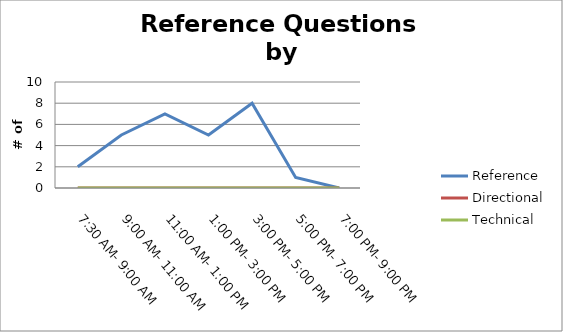
| Category | Reference | Directional | Technical |
|---|---|---|---|
| 7:30 AM- 9:00 AM | 2 | 0 | 0 |
| 9:00 AM- 11:00 AM | 5 | 0 | 0 |
| 11:00 AM- 1:00 PM | 7 | 0 | 0 |
| 1:00 PM- 3:00 PM | 5 | 0 | 0 |
| 3:00 PM- 5:00 PM | 8 | 0 | 0 |
| 5:00 PM- 7:00 PM | 1 | 0 | 0 |
| 7:00 PM- 9:00 PM | 0 | 0 | 0 |